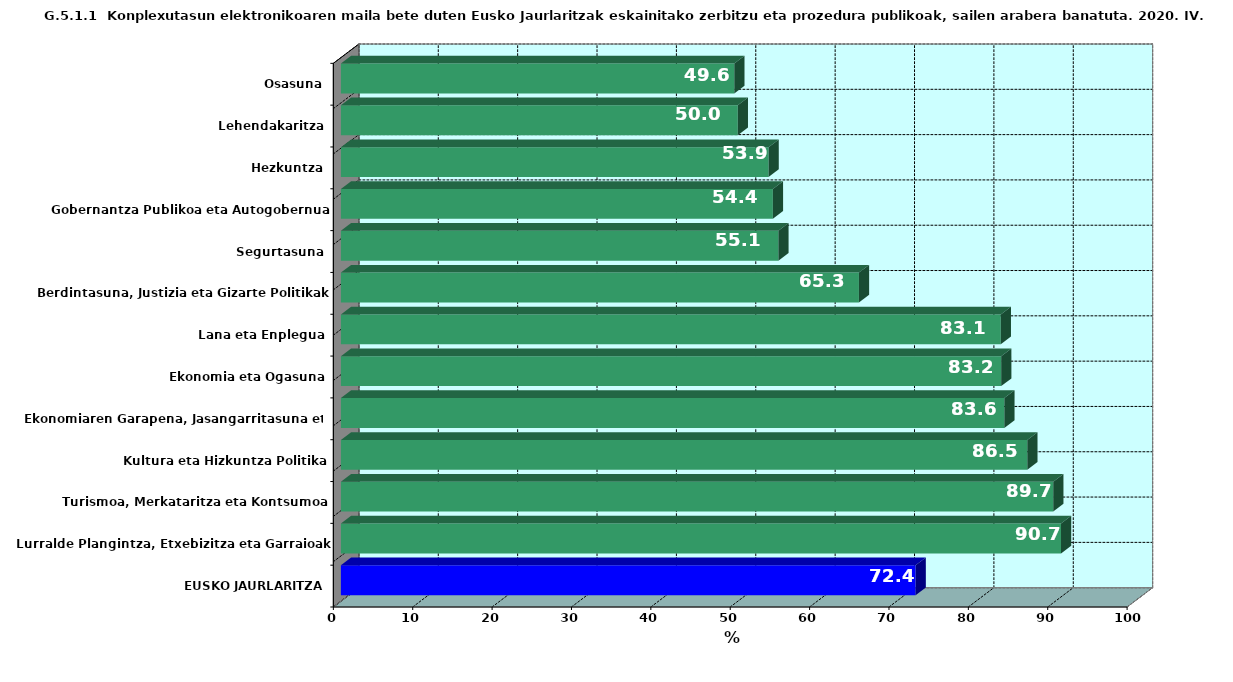
| Category | Series 0 |
|---|---|
| EUSKO JAURLARITZA | 72.406 |
| Lurralde Plangintza, Etxebizitza eta Garraioak | 90.722 |
| Turismoa, Merkataritza eta Kontsumoa | 89.744 |
| Kultura eta Hizkuntza Politika | 86.475 |
| Ekonomiaren Garapena, Jasangarritasuna eta Ingurumena | 83.582 |
| Ekonomia eta Ogasuna | 83.186 |
| Lana eta Enplegua | 83.133 |
| Berdintasuna, Justizia eta Gizarte Politikak | 65.263 |
| Segurtasuna | 55.114 |
| Gobernantza Publikoa eta Autogobernua | 54.422 |
| Hezkuntza | 53.879 |
| Lehendakaritza | 50 |
| Osasuna | 49.561 |